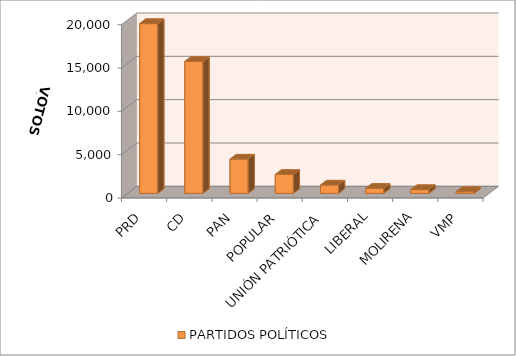
| Category | PARTIDOS POLÍTICOS |
|---|---|
| PRD | 19585 |
| CD | 15218 |
| PAN | 3950 |
| POPULAR | 2175 |
| UNIÓN PATRIÓTICA | 954 |
| LIBERAL | 570 |
| MOLIRENA | 428 |
| VMP | 196 |